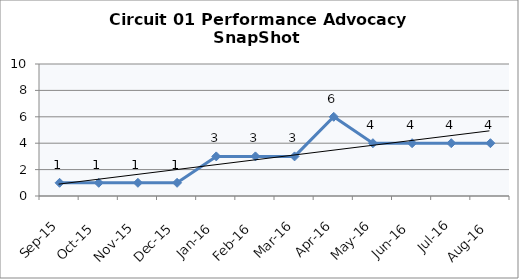
| Category | Circuit 01 |
|---|---|
| Sep-15 | 1 |
| Oct-15 | 1 |
| Nov-15 | 1 |
| Dec-15 | 1 |
| Jan-16 | 3 |
| Feb-16 | 3 |
| Mar-16 | 3 |
| Apr-16 | 6 |
| May-16 | 4 |
| Jun-16 | 4 |
| Jul-16 | 4 |
| Aug-16 | 4 |